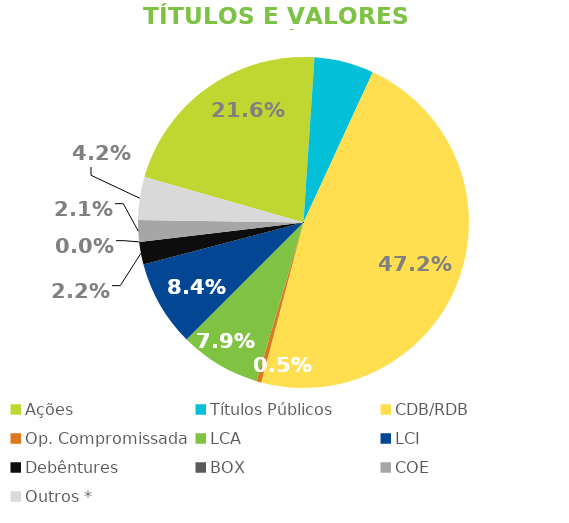
| Category | TVM |
|---|---|
| Ações | 0.216 |
| Títulos Públicos | 0.058 |
| CDB/RDB | 0.472 |
| Op. Compromissada | 0.005 |
| LCA | 0.079 |
| LCI | 0.084 |
| Debêntures | 0.022 |
| BOX | 0 |
| COE | 0.021 |
| Outros * | 0.042 |